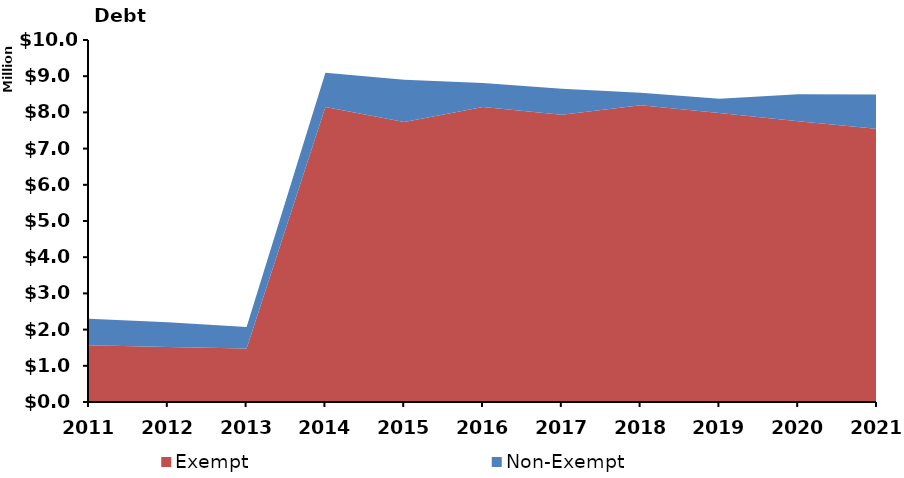
| Category | Exempt | Non-Exempt |
|---|---|---|
| 2011.0 | 1569224 | 729590 |
| 2012.0 | 1519254 | 682891 |
| 2013.0 | 1479235 | 593919 |
| 2014.0 | 8149600 | 946694 |
| 2015.0 | 7735127 | 1163445 |
| 2016.0 | 8150375 | 663187 |
| 2017.0 | 7938491 | 712877 |
| 2018.0 | 8199751 | 342856 |
| 2019.0 | 7985650 | 389636 |
| 2020.0 | 7755026 | 746146 |
| 2021.0 | 7546959 | 944408 |